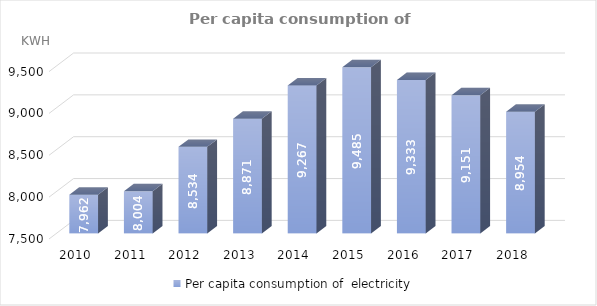
| Category | Per capita consumption of  electricity |
|---|---|
| 2010.0 | 7962.412 |
| 2011.0 | 8004.397 |
| 2012.0 | 8534.161 |
| 2013.0 | 8870.578 |
| 2014.0 | 9266.855 |
| 2015.0 | 9484.615 |
| 2016.0 | 9332.985 |
| 2017.0 | 9150.965 |
| 2018.0 | 8954.063 |